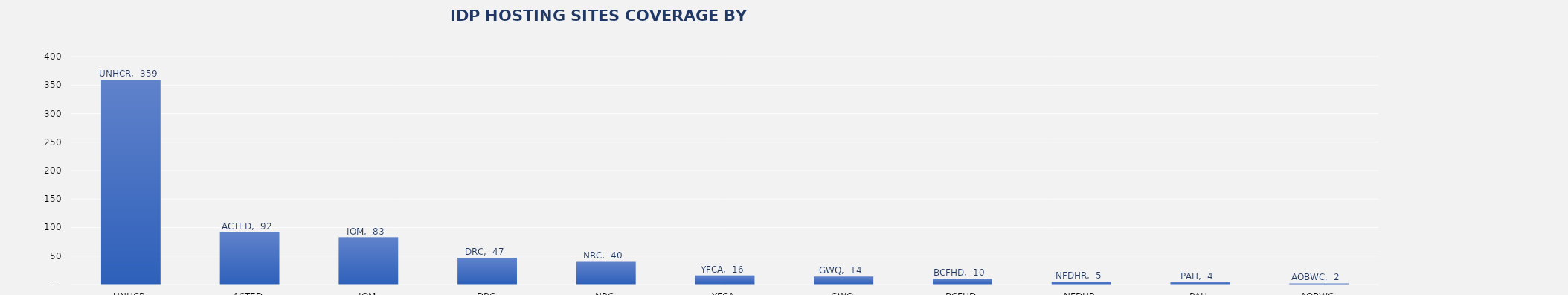
| Category | Total |
|---|---|
| UNHCR | 359 |
| ACTED | 92 |
| IOM | 83 |
| DRC | 47 |
| NRC | 40 |
| YFCA | 16 |
| GWQ | 14 |
| BCFHD | 10 |
| NFDHR | 5 |
| PAH | 4 |
| AOBWC | 2 |